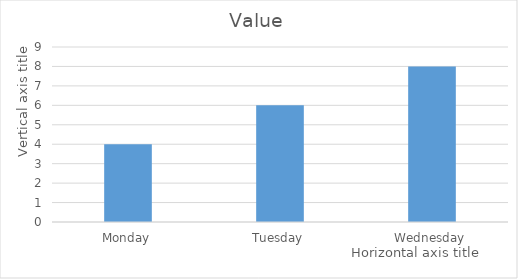
| Category | Value |
|---|---|
| Monday | 4 |
| Tuesday | 6 |
| Wednesday | 8 |